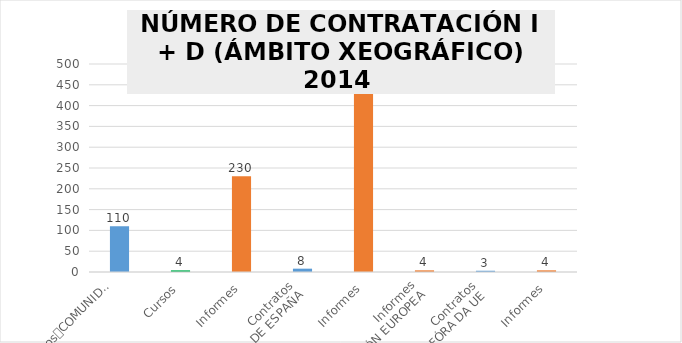
| Category | Series 0 |
|---|---|
| 0 | 110 |
| 1 | 4 |
| 2 | 230 |
| 3 | 8 |
| 4 | 479 |
| 5 | 4 |
| 6 | 3 |
| 7 | 4 |